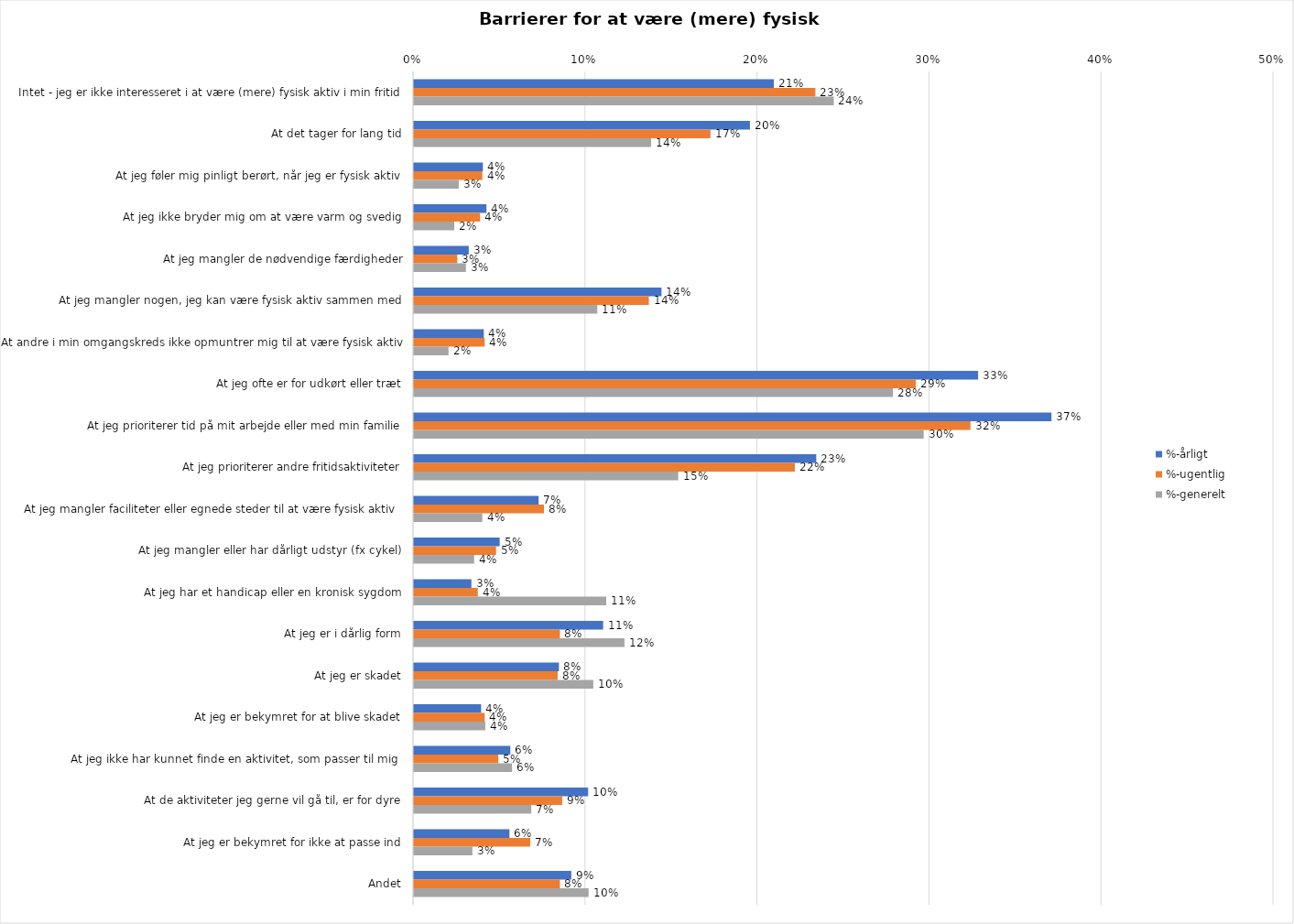
| Category | %-årligt | %-ugentlig | %-generelt |
|---|---|---|---|
| Intet - jeg er ikke interesseret i at være (mere) fysisk aktiv i min fritid | 0.209 | 0.233 | 0.244 |
| At det tager for lang tid | 0.195 | 0.172 | 0.138 |
| At jeg føler mig pinligt berørt, når jeg er fysisk aktiv | 0.04 | 0.04 | 0.026 |
| At jeg ikke bryder mig om at være varm og svedig | 0.042 | 0.038 | 0.023 |
| At jeg mangler de nødvendige færdigheder | 0.032 | 0.025 | 0.03 |
| At jeg mangler nogen, jeg kan være fysisk aktiv sammen med | 0.144 | 0.137 | 0.107 |
| At andre i min omgangskreds ikke opmuntrer mig til at være fysisk aktiv | 0.041 | 0.041 | 0.02 |
| At jeg ofte er for udkørt eller træt | 0.328 | 0.292 | 0.279 |
| At jeg prioriterer tid på mit arbejde eller med min familie | 0.371 | 0.324 | 0.296 |
| At jeg prioriterer andre fritidsaktiviteter | 0.234 | 0.221 | 0.154 |
| At jeg mangler faciliteter eller egnede steder til at være fysisk aktiv  | 0.072 | 0.076 | 0.04 |
| At jeg mangler eller har dårligt udstyr (fx cykel) | 0.05 | 0.048 | 0.035 |
| At jeg har et handicap eller en kronisk sygdom | 0.033 | 0.037 | 0.112 |
| At jeg er i dårlig form | 0.11 | 0.085 | 0.122 |
| At jeg er skadet | 0.084 | 0.084 | 0.104 |
| At jeg er bekymret for at blive skadet | 0.039 | 0.041 | 0.041 |
| At jeg ikke har kunnet finde en aktivitet, som passer til mig  | 0.056 | 0.049 | 0.057 |
| At de aktiviteter jeg gerne vil gå til, er for dyre | 0.101 | 0.086 | 0.068 |
| At jeg er bekymret for ikke at passe ind | 0.056 | 0.068 | 0.034 |
| Andet | 0.092 | 0.085 | 0.102 |